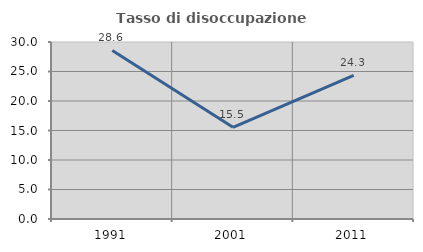
| Category | Tasso di disoccupazione giovanile  |
|---|---|
| 1991.0 | 28.571 |
| 2001.0 | 15.534 |
| 2011.0 | 24.324 |